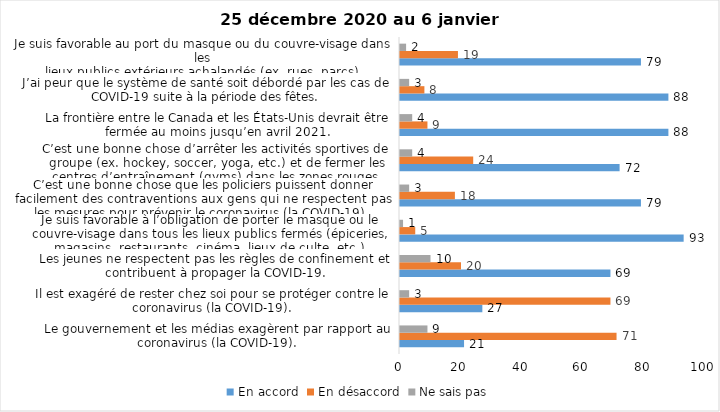
| Category | En accord | En désaccord | Ne sais pas |
|---|---|---|---|
| Le gouvernement et les médias exagèrent par rapport au coronavirus (la COVID-19). | 21 | 71 | 9 |
| Il est exagéré de rester chez soi pour se protéger contre le coronavirus (la COVID-19). | 27 | 69 | 3 |
| Les jeunes ne respectent pas les règles de confinement et contribuent à propager la COVID-19. | 69 | 20 | 10 |
| Je suis favorable à l’obligation de porter le masque ou le couvre-visage dans tous les lieux publics fermés (épiceries, magasins, restaurants, cinéma, lieux de culte, etc.). | 93 | 5 | 1 |
| C’est une bonne chose que les policiers puissent donner facilement des contraventions aux gens qui ne respectent pas les mesures pour prévenir le coronavirus (la COVID-19). | 79 | 18 | 3 |
| C’est une bonne chose d’arrêter les activités sportives de groupe (ex. hockey, soccer, yoga, etc.) et de fermer les centres d’entraînement (gyms) dans les zones rouges. | 72 | 24 | 4 |
| La frontière entre le Canada et les États-Unis devrait être fermée au moins jusqu’en avril 2021. | 88 | 9 | 4 |
| J’ai peur que le système de santé soit débordé par les cas de COVID-19 suite à la période des fêtes. | 88 | 8 | 3 |
| Je suis favorable au port du masque ou du couvre-visage dans les
lieux publics extérieurs achalandés (ex. rues, parcs) | 79 | 19 | 2 |